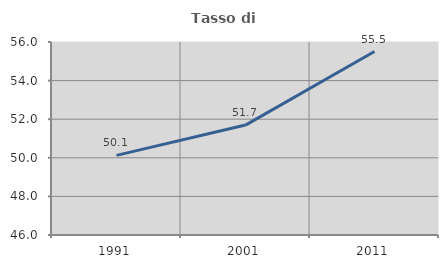
| Category | Tasso di occupazione   |
|---|---|
| 1991.0 | 50.125 |
| 2001.0 | 51.696 |
| 2011.0 | 55.505 |